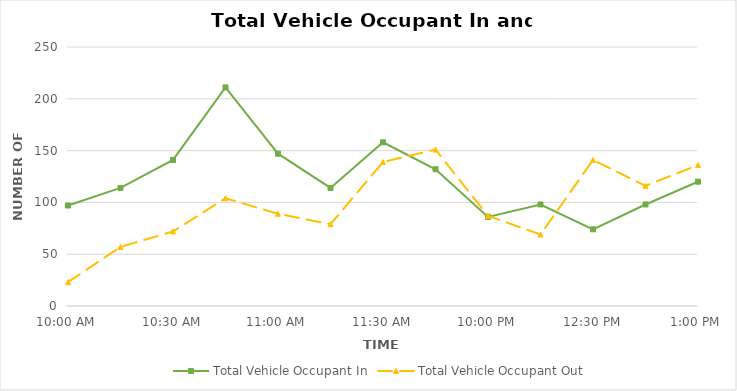
| Category | Total Vehicle Occupant In | Total Vehicle Occupant Out |
|---|---|---|
| 0.4166666666666667 | 97 | 23 |
| 0.4270833333333333 | 114 | 57 |
| 0.4375 | 141 | 72 |
| 0.4479166666666667 | 211 | 104 |
| 0.4583333333333333 | 147 | 89 |
| 0.46875 | 114 | 79 |
| 0.4791666666666667 | 158 | 139 |
| 0.4895833333333333 | 132 | 151 |
| 0.5 | 86 | 87 |
| 0.5104166666666666 | 98 | 69 |
| 0.5208333333333334 | 74 | 141 |
| 0.53125 | 98 | 116 |
| 0.5416666666666666 | 120 | 136 |